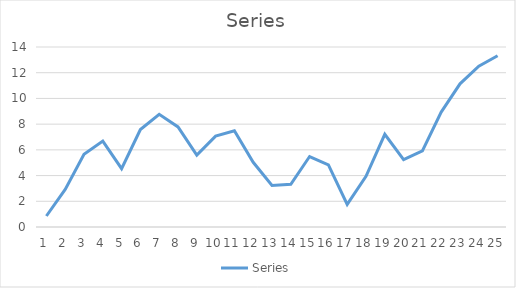
| Category | Series |
|---|---|
| 0 | 0.855 |
| 1 | 2.923 |
| 2 | 5.651 |
| 3 | 6.685 |
| 4 | 4.538 |
| 5 | 7.579 |
| 6 | 8.764 |
| 7 | 7.786 |
| 8 | 5.589 |
| 9 | 7.07 |
| 10 | 7.48 |
| 11 | 5.032 |
| 12 | 3.235 |
| 13 | 3.317 |
| 14 | 5.482 |
| 15 | 4.827 |
| 16 | 1.761 |
| 17 | 3.945 |
| 18 | 7.21 |
| 19 | 5.234 |
| 20 | 5.92 |
| 21 | 8.938 |
| 22 | 11.135 |
| 23 | 12.507 |
| 24 | 13.317 |